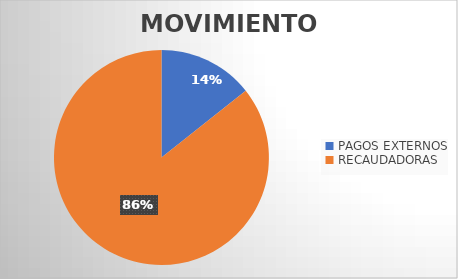
| Category | MOVIMIENTOS |
|---|---|
| PAGOS EXTERNOS | 9220 |
| RECAUDADORAS | 55132 |